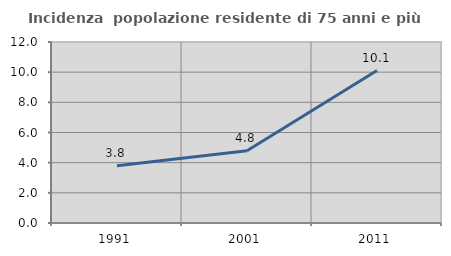
| Category | Incidenza  popolazione residente di 75 anni e più |
|---|---|
| 1991.0 | 3.789 |
| 2001.0 | 4.79 |
| 2011.0 | 10.106 |